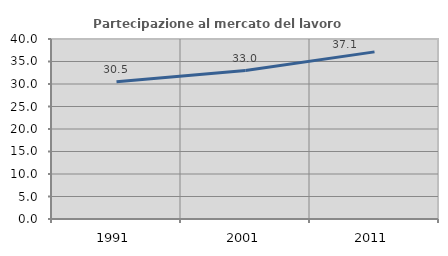
| Category | Partecipazione al mercato del lavoro  femminile |
|---|---|
| 1991.0 | 30.505 |
| 2001.0 | 32.99 |
| 2011.0 | 37.142 |